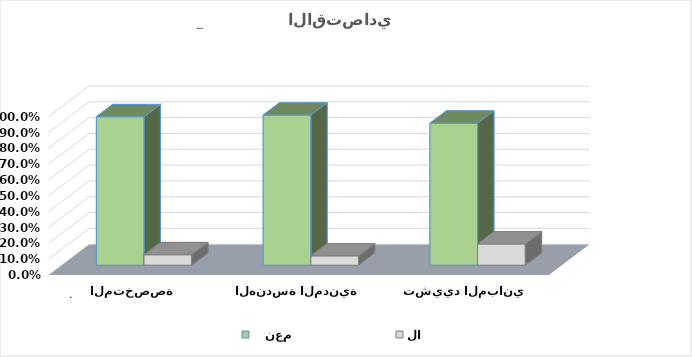
| Category |    نعم | لا  |
|---|---|---|
| تشييد المباني | 0.898 | 0.134 |
| الهندسة المدنية | 0.949 | 0.059 |
| أنشطة التشييد المتخصصة | 0.938 | 0.066 |